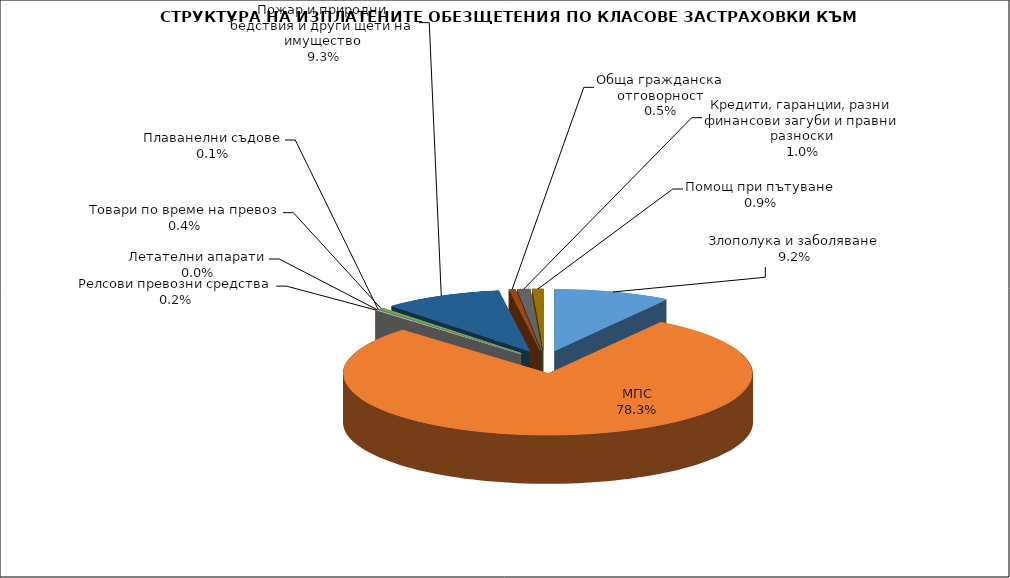
| Category | Злополука и заболяване |
|---|---|
| Злополука и заболяване | 0.092 |
| МПС | 0.783 |
| Релсови превозни средства | 0.002 |
| Летателни апарати | 0 |
| Плаванелни съдове | 0.001 |
| Товари по време на превоз | 0.004 |
| Пожар и природни бедствия и други щети на имущество | 0.093 |
| Обща гражданска отговорност | 0.005 |
| Кредити, гаранции, разни финансови загуби и правни разноски | 0.01 |
| Помощ при пътуване | 0.009 |